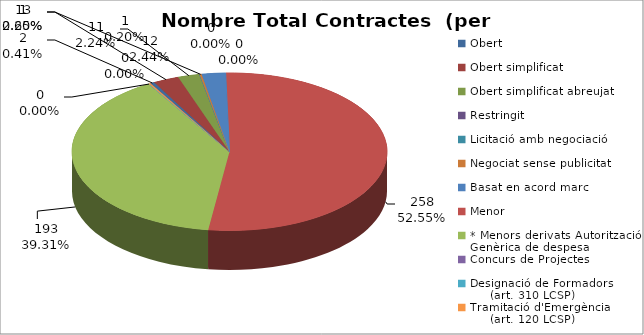
| Category | Nombre Total Contractes |
|---|---|
| Obert | 2 |
| Obert simplificat | 13 |
| Obert simplificat abreujat | 11 |
| Restringit | 0 |
| Licitació amb negociació | 0 |
| Negociat sense publicitat | 1 |
| Basat en acord marc | 12 |
| Menor | 258 |
| * Menors derivats Autorització Genèrica de despesa | 193 |
| Concurs de Projectes | 0 |
| Designació de Formadors
     (art. 310 LCSP) | 0 |
| Tramitació d'Emergència
     (art. 120 LCSP) | 1 |